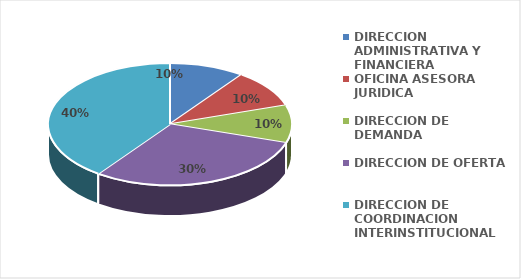
| Category | Series 0 |
|---|---|
| DIRECCION ADMINISTRATIVA Y FINANCIERA | 1 |
| OFICINA ASESORA JURIDICA | 1 |
| DIRECCION DE DEMANDA | 1 |
| DIRECCION DE OFERTA | 3 |
| DIRECCION DE COORDINACION INTERINSTITUCIONAL | 4 |